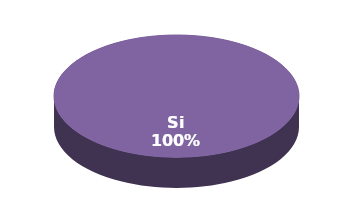
| Category | Series 1 |
|---|---|
| Si | 7 |